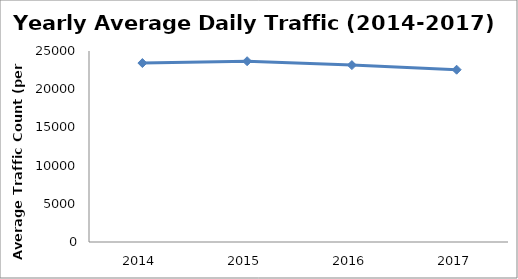
| Category | Series 0 |
|---|---|
| 2014.0 | 23422.759 |
| 2015.0 | 23664.082 |
| 2016.0 | 23153.117 |
| 2017.0 | 22550.485 |